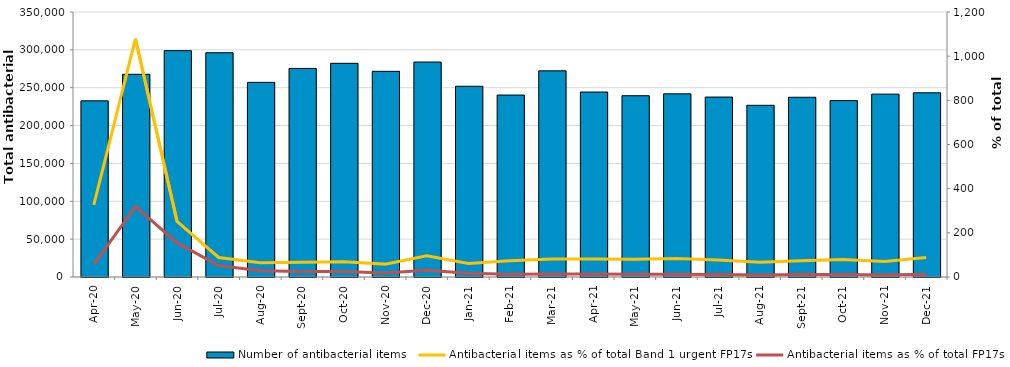
| Category | Number of antibacterial items |
|---|---|
| 2020-04-01 | 232663 |
| 2020-05-01 | 267719 |
| 2020-06-01 | 298900 |
| 2020-07-01 | 296204 |
| 2020-08-01 | 257079 |
| 2020-09-01 | 275461 |
| 2020-10-01 | 282215 |
| 2020-11-01 | 271627 |
| 2020-12-01 | 283882 |
| 2021-01-01 | 251874 |
| 2021-02-01 | 240300 |
| 2021-03-01 | 272301 |
| 2021-04-01 | 244282 |
| 2021-05-01 | 239428 |
| 2021-06-01 | 241887 |
| 2021-07-01 | 237634 |
| 2021-08-01 | 226777 |
| 2021-09-01 | 237373 |
| 2021-10-01 | 232962 |
| 2021-11-01 | 241513 |
| 2021-12-01 | 243281 |